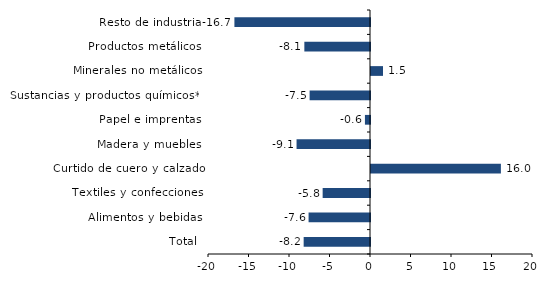
| Category | Series 0 |
|---|---|
| Total | -8.19 |
| Alimentos y bebidas | -7.582 |
| Textiles y confecciones | -5.846 |
| Curtido de cuero y calzado | 16.036 |
| Madera y muebles | -9.067 |
| Papel e imprentas | -0.626 |
| Sustancias y productos químicos** | -7.455 |
| Minerales no metálicos | 1.483 |
| Productos metálicos | -8.105 |
| Resto de industria | -16.74 |